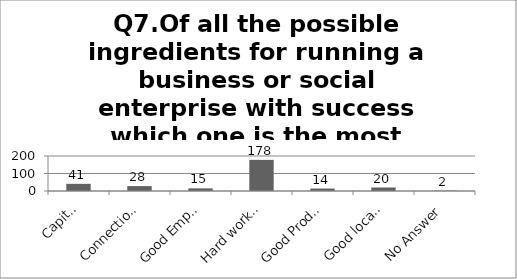
| Category | Q7.Of all the possible ingredients for running a business or social enterprise with success which one is the most important |
|---|---|
| Capital | 41 |
| Connections | 28 |
| Good Employees | 15 |
| Hard work and determination | 178 |
| Good Product or Service | 14 |
| Good location for the business | 20 |
| No Answer | 2 |